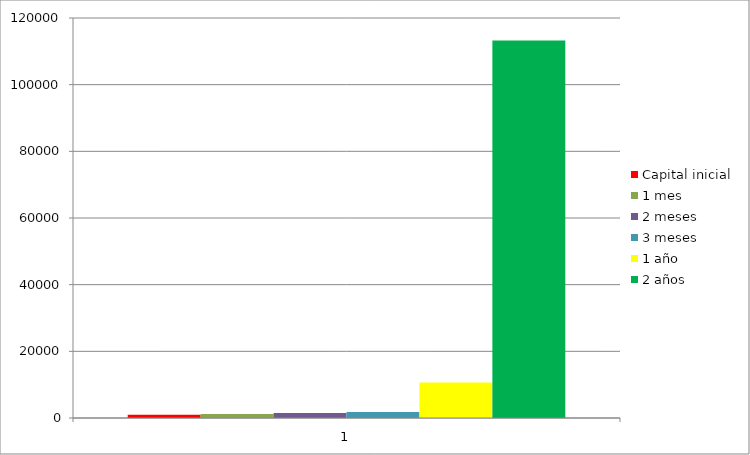
| Category | Capital inicial | 1 mes | 2 meses | 3 meses | 1 año | 2 años |
|---|---|---|---|---|---|---|
| 0 | 1000 | 1214.544 | 1475.118 | 1791.596 | 10642.151 | 113255.378 |